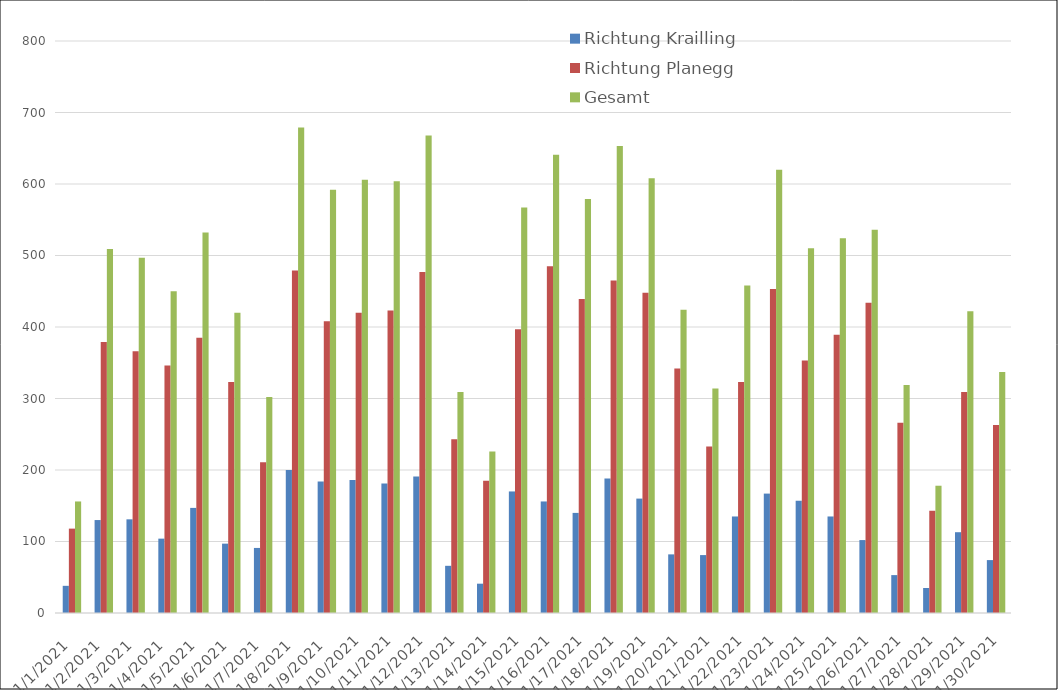
| Category | Richtung Krailling | Richtung Planegg | Gesamt |
|---|---|---|---|
| 11/1/21 | 38 | 118 | 156 |
| 11/2/21 | 130 | 379 | 509 |
| 11/3/21 | 131 | 366 | 497 |
| 11/4/21 | 104 | 346 | 450 |
| 11/5/21 | 147 | 385 | 532 |
| 11/6/21 | 97 | 323 | 420 |
| 11/7/21 | 91 | 211 | 302 |
| 11/8/21 | 200 | 479 | 679 |
| 11/9/21 | 184 | 408 | 592 |
| 11/10/21 | 186 | 420 | 606 |
| 11/11/21 | 181 | 423 | 604 |
| 11/12/21 | 191 | 477 | 668 |
| 11/13/21 | 66 | 243 | 309 |
| 11/14/21 | 41 | 185 | 226 |
| 11/15/21 | 170 | 397 | 567 |
| 11/16/21 | 156 | 485 | 641 |
| 11/17/21 | 140 | 439 | 579 |
| 11/18/21 | 188 | 465 | 653 |
| 11/19/21 | 160 | 448 | 608 |
| 11/20/21 | 82 | 342 | 424 |
| 11/21/21 | 81 | 233 | 314 |
| 11/22/21 | 135 | 323 | 458 |
| 11/23/21 | 167 | 453 | 620 |
| 11/24/21 | 157 | 353 | 510 |
| 11/25/21 | 135 | 389 | 524 |
| 11/26/21 | 102 | 434 | 536 |
| 11/27/21 | 53 | 266 | 319 |
| 11/28/21 | 35 | 143 | 178 |
| 11/29/21 | 113 | 309 | 422 |
| 11/30/21 | 74 | 263 | 337 |